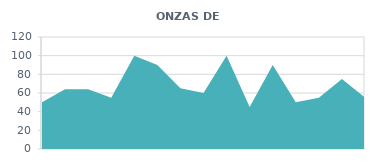
| Category | ONZAS DE AGUA |
|---|---|
| 0 | 50 |
| 1 | 64 |
| 2 | 64 |
| 3 | 55 |
| 4 | 100 |
| 5 | 90 |
| 6 | 65 |
| 7 | 60 |
| 8 | 100 |
| 9 | 45 |
| 10 | 90 |
| 11 | 50 |
| 12 | 55 |
| 13 | 75 |
| 14 | 55 |